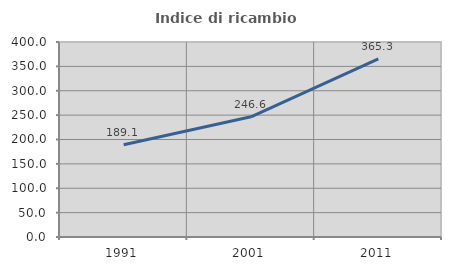
| Category | Indice di ricambio occupazionale  |
|---|---|
| 1991.0 | 189.07 |
| 2001.0 | 246.646 |
| 2011.0 | 365.283 |